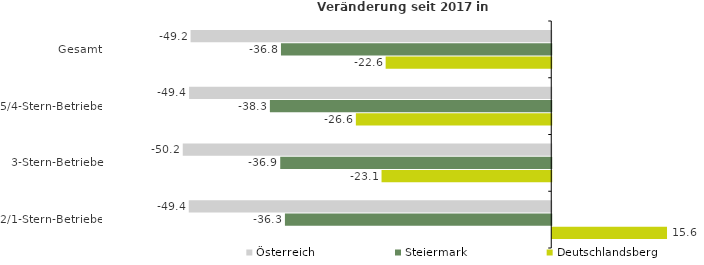
| Category | Österreich | Steiermark | Deutschlandsberg |
|---|---|---|---|
| Gesamt | -49.154 | -36.835 | -22.569 |
| 5/4-Stern-Betriebe | -49.355 | -38.346 | -26.628 |
| 3-Stern-Betriebe | -50.222 | -36.936 | -23.129 |
| 2/1-Stern-Betriebe | -49.399 | -36.296 | 15.641 |